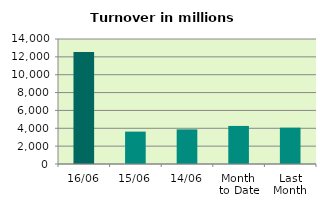
| Category | Series 0 |
|---|---|
| 16/06 | 12545.214 |
| 15/06 | 3628.013 |
| 14/06 | 3878.085 |
| Month 
to Date | 4262.626 |
| Last
Month | 4067.502 |